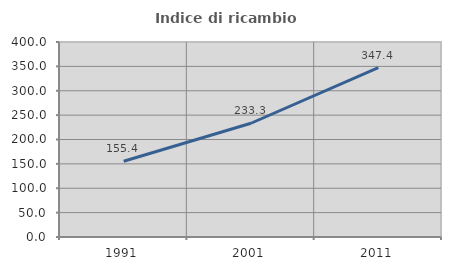
| Category | Indice di ricambio occupazionale  |
|---|---|
| 1991.0 | 155.405 |
| 2001.0 | 233.333 |
| 2011.0 | 347.368 |